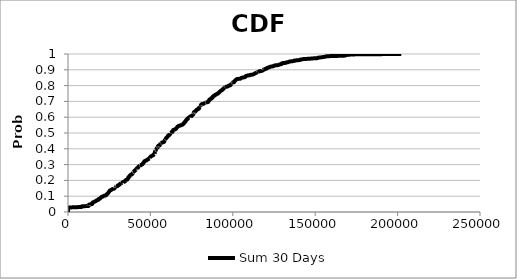
| Category | Sum 30 Days |
|---|---|
| 0.0 | 0 |
| 0.0 | 0.002 |
| 0.0 | 0.004 |
| 0.0 | 0.006 |
| 0.0 | 0.008 |
| 0.0 | 0.01 |
| 0.0 | 0.012 |
| 0.0 | 0.014 |
| 0.0 | 0.016 |
| 0.0 | 0.018 |
| 0.0 | 0.02 |
| 0.0 | 0.022 |
| 0.0 | 0.024 |
| 0.0 | 0.026 |
| 0.0 | 0.028 |
| 4384.535377252997 | 0.03 |
| 8053.44815584514 | 0.032 |
| 8393.539124116945 | 0.034 |
| 8637.817650083685 | 0.036 |
| 12250.977501089461 | 0.038 |
| 12282.858624550032 | 0.04 |
| 12287.67683887589 | 0.042 |
| 12705.141995330034 | 0.044 |
| 12742.290751993609 | 0.046 |
| 13164.703533458898 | 0.048 |
| 14585.86817302253 | 0.05 |
| 14627.355621057577 | 0.052 |
| 14688.759388706278 | 0.054 |
| 14853.524449337687 | 0.056 |
| 14907.934521648542 | 0.058 |
| 14974.783526923222 | 0.06 |
| 15397.504911194832 | 0.062 |
| 15960.807001577265 | 0.064 |
| 16200.387000641847 | 0.066 |
| 16786.579702436276 | 0.068 |
| 16980.59615542301 | 0.07 |
| 17222.997600847124 | 0.072 |
| 17511.679918341873 | 0.074 |
| 18307.399364448065 | 0.076 |
| 18373.208231124427 | 0.078 |
| 18443.835920032703 | 0.08 |
| 18567.274433698323 | 0.082 |
| 19268.63075556302 | 0.084 |
| 19478.616770329238 | 0.086 |
| 19746.52422946259 | 0.088 |
| 19790.440496456642 | 0.09 |
| 20107.651769629334 | 0.092 |
| 20207.12958834276 | 0.094 |
| 20481.695913725598 | 0.096 |
| 21253.046178242574 | 0.098 |
| 21515.005683289688 | 0.1 |
| 21709.160826688872 | 0.102 |
| 22448.97967190204 | 0.104 |
| 23198.412939577305 | 0.106 |
| 23240.354887572474 | 0.108 |
| 23260.726697284234 | 0.11 |
| 23514.85719497913 | 0.112 |
| 23780.32572050314 | 0.114 |
| 24085.254864481416 | 0.116 |
| 24208.979877600745 | 0.118 |
| 24357.71249321604 | 0.12 |
| 24484.607186127105 | 0.122 |
| 24569.741575591026 | 0.124 |
| 24775.818269160507 | 0.126 |
| 24933.099363411573 | 0.128 |
| 24973.21271391074 | 0.13 |
| 25138.06685359301 | 0.132 |
| 25206.234397225493 | 0.134 |
| 25462.436069982235 | 0.136 |
| 25978.94760748758 | 0.138 |
| 26239.495388463023 | 0.14 |
| 26594.47178088848 | 0.142 |
| 26801.916696857952 | 0.144 |
| 27455.186039382355 | 0.146 |
| 27987.41223462252 | 0.148 |
| 28223.806800777675 | 0.15 |
| 28347.029314109386 | 0.152 |
| 28362.262565501136 | 0.154 |
| 28888.354677884156 | 0.156 |
| 28961.24368853641 | 0.158 |
| 28966.33491955856 | 0.16 |
| 29211.409681888454 | 0.162 |
| 30116.05154131138 | 0.164 |
| 30135.805028637093 | 0.166 |
| 30327.27450662541 | 0.168 |
| 30706.516657503602 | 0.17 |
| 30978.476170937887 | 0.172 |
| 31379.475370911998 | 0.174 |
| 31427.117355579783 | 0.176 |
| 31635.798812290122 | 0.178 |
| 32184.10792058062 | 0.18 |
| 32189.301468294034 | 0.182 |
| 33078.76934286682 | 0.184 |
| 33143.77165748409 | 0.186 |
| 33437.73614677478 | 0.188 |
| 33474.881216030466 | 0.19 |
| 34475.67987400318 | 0.192 |
| 34573.75065263715 | 0.194 |
| 34690.83112178987 | 0.196 |
| 34749.30292788706 | 0.198 |
| 34963.3509661655 | 0.2 |
| 35177.26510983005 | 0.202 |
| 35725.96391043578 | 0.204 |
| 36023.03263155369 | 0.206 |
| 36061.135276501234 | 0.208 |
| 36157.95489201698 | 0.21 |
| 36501.95181961196 | 0.212 |
| 36570.8347569895 | 0.214 |
| 36613.9687741837 | 0.216 |
| 36654.02406942358 | 0.218 |
| 36676.36090971323 | 0.22 |
| 37227.470089011724 | 0.222 |
| 37251.639790259724 | 0.224 |
| 37357.82514769392 | 0.226 |
| 37393.87311849891 | 0.228 |
| 37633.58372710312 | 0.23 |
| 37671.81075239736 | 0.232 |
| 38018.395339913135 | 0.234 |
| 38504.622129828225 | 0.236 |
| 38716.77957784313 | 0.238 |
| 38816.311331786186 | 0.24 |
| 39206.83962275906 | 0.242 |
| 39224.598379798845 | 0.244 |
| 39375.10829737269 | 0.246 |
| 39380.22139702487 | 0.248 |
| 39386.19893809424 | 0.251 |
| 39466.23934599363 | 0.253 |
| 39803.7069491596 | 0.255 |
| 39942.198771652664 | 0.257 |
| 40241.3440803461 | 0.259 |
| 40478.060680085175 | 0.261 |
| 40535.80607215858 | 0.263 |
| 40720.6873984892 | 0.265 |
| 41064.42009820191 | 0.267 |
| 41511.04932027355 | 0.269 |
| 41511.15418239607 | 0.271 |
| 41678.98982728472 | 0.273 |
| 41735.629273036015 | 0.275 |
| 41769.26360598495 | 0.277 |
| 42101.37445974743 | 0.279 |
| 42499.39451308582 | 0.281 |
| 42548.55926307582 | 0.283 |
| 42593.00926518503 | 0.285 |
| 42691.33643980454 | 0.287 |
| 43018.70439812959 | 0.289 |
| 43427.48690643657 | 0.291 |
| 43433.27948761149 | 0.293 |
| 43675.702964456286 | 0.295 |
| 44307.521852974365 | 0.297 |
| 44490.15880458953 | 0.299 |
| 44847.27785605003 | 0.301 |
| 45089.47466219739 | 0.303 |
| 45165.515882540465 | 0.305 |
| 45487.60665553056 | 0.307 |
| 45685.42182944039 | 0.309 |
| 45730.76111323829 | 0.311 |
| 45844.24677777215 | 0.313 |
| 46044.52896305043 | 0.315 |
| 46132.4896222235 | 0.317 |
| 46239.2123596218 | 0.319 |
| 46319.68701289862 | 0.321 |
| 46820.426367705055 | 0.323 |
| 46908.078007056945 | 0.325 |
| 47653.047558212565 | 0.327 |
| 47840.98418710473 | 0.329 |
| 48134.96935127968 | 0.331 |
| 48258.24686208984 | 0.333 |
| 48744.83100887225 | 0.335 |
| 49076.89875401515 | 0.337 |
| 49583.69667562214 | 0.339 |
| 49598.91609478316 | 0.341 |
| 49642.58600665623 | 0.343 |
| 49817.79418564154 | 0.345 |
| 49838.161439096264 | 0.347 |
| 49996.23348002946 | 0.349 |
| 50095.81678907637 | 0.351 |
| 50594.68830283999 | 0.353 |
| 50746.948490317685 | 0.355 |
| 51098.80316030064 | 0.357 |
| 51558.55646292849 | 0.359 |
| 51717.624671012665 | 0.361 |
| 52079.80713675459 | 0.363 |
| 52098.03037055378 | 0.365 |
| 52495.14466712273 | 0.367 |
| 52507.3438463448 | 0.369 |
| 52529.03220564063 | 0.371 |
| 52621.025349878546 | 0.373 |
| 52693.0909889585 | 0.375 |
| 52727.619117779286 | 0.377 |
| 52759.9272742655 | 0.379 |
| 52783.8608445787 | 0.381 |
| 52893.532206528354 | 0.383 |
| 52907.20312389913 | 0.385 |
| 52966.656326731834 | 0.387 |
| 53017.6839514445 | 0.389 |
| 53022.49093353479 | 0.391 |
| 53041.84544614812 | 0.393 |
| 53346.10241228879 | 0.395 |
| 53400.49602567597 | 0.397 |
| 53617.272495316545 | 0.399 |
| 53790.10888337399 | 0.401 |
| 54014.51623891907 | 0.403 |
| 54028.55603443493 | 0.405 |
| 54210.1897767301 | 0.407 |
| 54485.505185130205 | 0.409 |
| 54517.57741802069 | 0.411 |
| 54522.00166366303 | 0.413 |
| 54608.61193101715 | 0.415 |
| 54630.1546822815 | 0.417 |
| 54810.69092588744 | 0.419 |
| 55483.45796034265 | 0.421 |
| 55630.22903411387 | 0.423 |
| 55802.81361984946 | 0.425 |
| 55820.591888725496 | 0.427 |
| 55861.36194442118 | 0.429 |
| 56120.536552514815 | 0.431 |
| 56130.96614127762 | 0.433 |
| 56395.361189700736 | 0.435 |
| 56717.06591314011 | 0.437 |
| 56837.16672175804 | 0.439 |
| 57394.647198252635 | 0.441 |
| 58134.06854016297 | 0.443 |
| 58350.22448312568 | 0.445 |
| 58378.37965365853 | 0.447 |
| 58574.96248860993 | 0.449 |
| 58613.91502296528 | 0.451 |
| 58719.40839986903 | 0.453 |
| 58895.94205294516 | 0.455 |
| 58902.4533822694 | 0.457 |
| 59046.88770944488 | 0.459 |
| 59148.354760158065 | 0.461 |
| 59304.671841104304 | 0.463 |
| 59389.22067535525 | 0.465 |
| 59428.04291120732 | 0.467 |
| 59662.28346780645 | 0.469 |
| 59805.33755812324 | 0.471 |
| 60168.07188804345 | 0.473 |
| 60324.419489104825 | 0.475 |
| 60404.990307594824 | 0.477 |
| 60459.47748128336 | 0.479 |
| 60582.78211640338 | 0.481 |
| 60823.48961763291 | 0.483 |
| 60853.38268609923 | 0.485 |
| 61513.80970807222 | 0.487 |
| 61546.09043003213 | 0.489 |
| 61726.15093637963 | 0.491 |
| 61920.55370987862 | 0.493 |
| 62034.543242710984 | 0.495 |
| 62085.14996305827 | 0.497 |
| 62092.27673543955 | 0.499 |
| 62541.72594322167 | 0.501 |
| 62719.496247966825 | 0.503 |
| 62837.688058160944 | 0.505 |
| 63352.13035558876 | 0.507 |
| 63422.07603587104 | 0.509 |
| 63485.46215539218 | 0.511 |
| 63514.51878971534 | 0.513 |
| 63705.93992922957 | 0.515 |
| 63761.77801814006 | 0.517 |
| 63872.21697705425 | 0.519 |
| 64564.49322852741 | 0.521 |
| 64748.216268692755 | 0.523 |
| 65283.16726938379 | 0.525 |
| 65598.25673772086 | 0.527 |
| 65659.80915009604 | 0.529 |
| 65879.82732775522 | 0.531 |
| 66058.82280062899 | 0.533 |
| 66204.47340442006 | 0.535 |
| 66234.91381856328 | 0.537 |
| 66385.86716090754 | 0.539 |
| 66799.05270855081 | 0.541 |
| 66900.72328720576 | 0.543 |
| 67105.04590326508 | 0.545 |
| 68221.20932989585 | 0.547 |
| 68305.82070467244 | 0.549 |
| 68970.8445829089 | 0.551 |
| 69603.90418405832 | 0.553 |
| 69808.29459724718 | 0.555 |
| 69860.34537146009 | 0.557 |
| 69993.01020748883 | 0.559 |
| 70017.40505936474 | 0.561 |
| 70545.6548627351 | 0.563 |
| 70587.82646638941 | 0.565 |
| 70692.44375396398 | 0.567 |
| 70794.85124883421 | 0.569 |
| 71210.89169462574 | 0.571 |
| 71365.8329055107 | 0.573 |
| 71385.76507572994 | 0.575 |
| 71476.36851368668 | 0.577 |
| 71495.09351172336 | 0.579 |
| 71767.88244747458 | 0.581 |
| 71825.74339683025 | 0.583 |
| 72014.02520941003 | 0.585 |
| 72434.35714591636 | 0.587 |
| 72492.01676903894 | 0.589 |
| 72623.34370118163 | 0.591 |
| 72873.33080432832 | 0.593 |
| 72982.82102652817 | 0.595 |
| 73790.70127458169 | 0.597 |
| 73806.94529902245 | 0.599 |
| 73834.25333193148 | 0.601 |
| 73991.42161513734 | 0.603 |
| 74355.34102455192 | 0.605 |
| 74986.19874952795 | 0.607 |
| 75172.75205067548 | 0.609 |
| 75261.71717430944 | 0.611 |
| 75401.15246344448 | 0.613 |
| 75693.85038229996 | 0.615 |
| 75997.43735359187 | 0.617 |
| 76022.66983373632 | 0.619 |
| 76029.46180666322 | 0.621 |
| 76119.80394587667 | 0.623 |
| 76295.29559808256 | 0.625 |
| 76302.39586776137 | 0.627 |
| 76372.9307897801 | 0.629 |
| 76406.45353114301 | 0.631 |
| 76593.18350811812 | 0.633 |
| 77234.83674193971 | 0.635 |
| 77311.64835738202 | 0.637 |
| 77534.52506476597 | 0.639 |
| 77656.95844694549 | 0.641 |
| 77737.70420928832 | 0.643 |
| 78105.63866998808 | 0.645 |
| 78237.54903759065 | 0.647 |
| 78304.91307829319 | 0.649 |
| 79149.53743921123 | 0.651 |
| 79221.12024120906 | 0.653 |
| 79280.51283675668 | 0.655 |
| 79617.26246672562 | 0.657 |
| 79637.13512278331 | 0.659 |
| 79749.51452247116 | 0.661 |
| 79764.71453936509 | 0.663 |
| 79899.72925532337 | 0.665 |
| 79899.78520031415 | 0.667 |
| 80345.95011641645 | 0.669 |
| 80377.99647223845 | 0.671 |
| 80389.62538259599 | 0.673 |
| 80686.46027437632 | 0.675 |
| 80730.36211263954 | 0.677 |
| 81068.43791017364 | 0.679 |
| 81105.03908803873 | 0.681 |
| 81384.82661838781 | 0.683 |
| 82377.25873866428 | 0.685 |
| 82640.0187176494 | 0.687 |
| 83277.80502092741 | 0.689 |
| 83280.70445241065 | 0.691 |
| 83488.95131768337 | 0.693 |
| 84697.9000151984 | 0.695 |
| 85191.05460425616 | 0.697 |
| 85254.80315715139 | 0.699 |
| 85310.42930013446 | 0.701 |
| 85418.85863733888 | 0.703 |
| 85530.32564926625 | 0.705 |
| 85622.58940738233 | 0.707 |
| 85726.37624172877 | 0.709 |
| 85771.818948801 | 0.711 |
| 86315.78970911365 | 0.713 |
| 86479.00199423514 | 0.715 |
| 86863.37314341808 | 0.717 |
| 86880.7477388608 | 0.719 |
| 87167.72282813395 | 0.721 |
| 87717.39912969636 | 0.723 |
| 87746.17799034715 | 0.725 |
| 87788.10612912908 | 0.727 |
| 87822.38124458154 | 0.729 |
| 87996.42659510755 | 0.731 |
| 88304.9344212688 | 0.733 |
| 88503.01378624231 | 0.735 |
| 89126.48125940924 | 0.737 |
| 89213.6185383853 | 0.739 |
| 89244.34667969965 | 0.741 |
| 89809.54561052468 | 0.743 |
| 90017.79179117327 | 0.745 |
| 90502.91144415279 | 0.747 |
| 90956.150258887 | 0.749 |
| 90979.25342411308 | 0.752 |
| 91474.00821300842 | 0.754 |
| 91541.9852439569 | 0.756 |
| 91832.33748334686 | 0.758 |
| 91861.46153684599 | 0.76 |
| 92108.40259525728 | 0.762 |
| 92328.41723355958 | 0.764 |
| 92409.6598184455 | 0.766 |
| 92923.63382363867 | 0.768 |
| 93010.12375749831 | 0.77 |
| 93432.88263096916 | 0.772 |
| 93732.99103411796 | 0.774 |
| 93935.90678614558 | 0.776 |
| 94029.74103587934 | 0.778 |
| 94183.06459251336 | 0.78 |
| 94540.83913647922 | 0.782 |
| 94653.7732902882 | 0.784 |
| 94713.37206285573 | 0.786 |
| 94985.17446169464 | 0.788 |
| 94988.09520744436 | 0.79 |
| 95366.17505523085 | 0.792 |
| 96510.58896795394 | 0.794 |
| 97078.21297646344 | 0.796 |
| 97305.10901481434 | 0.798 |
| 97498.78776052181 | 0.8 |
| 98388.75424906338 | 0.802 |
| 98699.75972298044 | 0.804 |
| 98855.61685946144 | 0.806 |
| 98954.33242742703 | 0.808 |
| 99147.66859682622 | 0.81 |
| 99152.2883613438 | 0.812 |
| 99167.74798758162 | 0.814 |
| 99329.85066905349 | 0.816 |
| 99330.41518267598 | 0.818 |
| 99695.3350242517 | 0.82 |
| 100740.40124408317 | 0.822 |
| 100822.16786670781 | 0.824 |
| 100879.25856976467 | 0.826 |
| 100967.97869487136 | 0.828 |
| 101271.54899858411 | 0.83 |
| 101350.50683832788 | 0.832 |
| 101717.46195022998 | 0.834 |
| 101761.44595948239 | 0.836 |
| 101908.29252996536 | 0.838 |
| 102199.06496928161 | 0.84 |
| 102691.60527038512 | 0.842 |
| 104494.97254665972 | 0.844 |
| 104920.19573231475 | 0.846 |
| 104964.23315855119 | 0.848 |
| 105502.82272975857 | 0.85 |
| 106354.71037101446 | 0.852 |
| 107423.24835052871 | 0.854 |
| 107610.60363202832 | 0.856 |
| 107664.46289932079 | 0.858 |
| 107825.75436267201 | 0.86 |
| 108290.12935617285 | 0.862 |
| 109056.37648617414 | 0.864 |
| 110219.18569137924 | 0.866 |
| 110527.70102072215 | 0.868 |
| 112020.46570518981 | 0.87 |
| 112436.8614683621 | 0.872 |
| 112980.5101942322 | 0.874 |
| 113127.45373929461 | 0.876 |
| 113618.79365228242 | 0.878 |
| 113981.13095681049 | 0.88 |
| 114539.56663889269 | 0.882 |
| 114546.4209860739 | 0.884 |
| 115288.39699348653 | 0.886 |
| 115695.11803844283 | 0.888 |
| 115794.11815559768 | 0.89 |
| 116787.48531813658 | 0.892 |
| 117757.1985140174 | 0.894 |
| 118080.92485790758 | 0.896 |
| 118176.35607036858 | 0.898 |
| 118188.43804505173 | 0.9 |
| 118631.34734687582 | 0.902 |
| 119521.13392635813 | 0.904 |
| 119724.50827848626 | 0.906 |
| 120560.1942093978 | 0.908 |
| 120664.13952520961 | 0.91 |
| 120828.49849335187 | 0.912 |
| 121518.88564274169 | 0.914 |
| 121893.26353316745 | 0.916 |
| 122468.80297631933 | 0.918 |
| 122948.39957983351 | 0.92 |
| 124077.83122302499 | 0.922 |
| 124898.33091325959 | 0.924 |
| 125019.63893090103 | 0.926 |
| 125587.29704841392 | 0.928 |
| 127452.32772989609 | 0.93 |
| 128048.50377046844 | 0.932 |
| 128396.13931056604 | 0.934 |
| 129465.59974465608 | 0.936 |
| 129554.29470394648 | 0.938 |
| 129700.31021802066 | 0.94 |
| 129979.3058944986 | 0.942 |
| 131970.1272862145 | 0.944 |
| 132353.59119380932 | 0.946 |
| 133346.79161857947 | 0.948 |
| 133844.67075175408 | 0.95 |
| 134351.2940158514 | 0.952 |
| 135592.0859232938 | 0.954 |
| 137136.78396139218 | 0.956 |
| 137167.82271835377 | 0.958 |
| 138603.60054051407 | 0.96 |
| 140677.43351573937 | 0.962 |
| 140819.95397212176 | 0.964 |
| 141908.33200059546 | 0.966 |
| 142956.82437949989 | 0.968 |
| 146215.32149174402 | 0.97 |
| 148410.80402955125 | 0.972 |
| 151396.68449902197 | 0.974 |
| 151601.85708986042 | 0.976 |
| 152884.55325010975 | 0.978 |
| 154358.11273537876 | 0.98 |
| 155562.14001641062 | 0.982 |
| 156630.4242325639 | 0.984 |
| 157311.7544337085 | 0.986 |
| 163629.1223003284 | 0.988 |
| 168147.90332219447 | 0.99 |
| 168223.5602111373 | 0.992 |
| 169188.50916312484 | 0.994 |
| 171069.94563974557 | 0.996 |
| 176302.1647826241 | 0.998 |
| 202214.7768447734 | 1 |